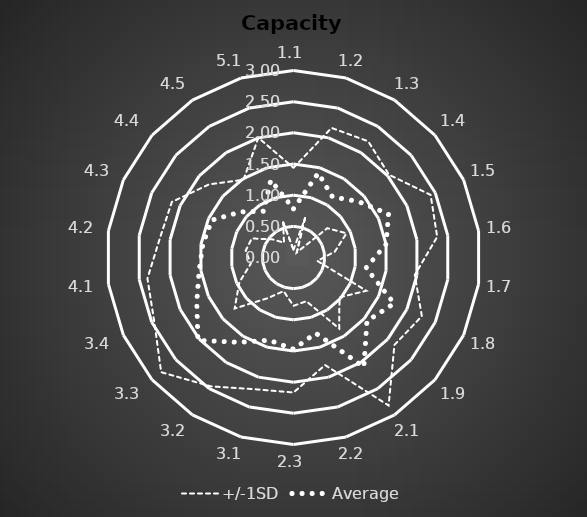
| Category | +/-1SD | Average | Series 2 |
|---|---|---|---|
| 1.1 | 1.439 | 0.781 | 0.124 |
| 1.2 | 2.167 | 1.412 | 0.657 |
| 1.3 | 2.216 | 1.156 | 0.096 |
| 1.4 | 2.027 | 1.373 | 0.718 |
| 1.5 | 2.418 | 1.676 | 0.935 |
| 1.6 | 2.329 | 1.5 | 0.671 |
| 1.7 | 1.966 | 1.176 | 0.387 |
| 1.8 | 2.264 | 1.775 | 1.285 |
| 1.9 | 2.142 | 1.559 | 0.976 |
| 2.1 | 2.822 | 2.088 | 1.354 |
| 2.2 | 1.798 | 1.265 | 0.731 |
| 2.3 | 2.166 | 1.471 | 0.775 |
| 3.1 | 2.203 | 1.382 | 0.562 |
| 3.2 | 2.457 | 1.618 | 0.779 |
| 3.3 | 2.809 | 2.029 | 1.249 |
| 3.4 | 2.457 | 1.706 | 0.955 |
| 4.1 | 2.367 | 1.529 | 0.691 |
| 4.2 | 2.166 | 1.471 | 0.775 |
| 4.3 | 2.146 | 1.441 | 0.737 |
| 4.4 | 1.791 | 1.118 | 0.444 |
| 4.5 | 1.483 | 0.882 | 0.282 |
| 5.1 | 2.003 | 1.294 | 0.586 |